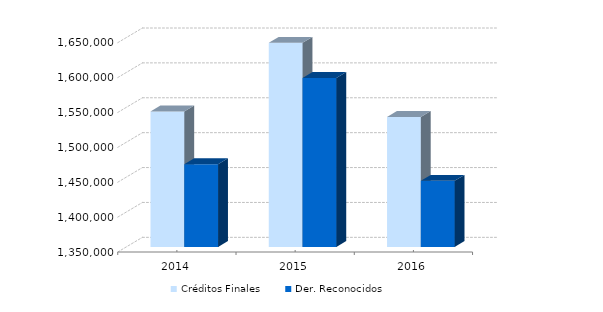
| Category | Créditos Finales | Der. Reconocidos |
|---|---|---|
| 2014.0 | 1544240.44 | 1468607.32 |
| 2015.0 | 1642508.38 | 1592262.83 |
| 2016.0 | 1536381.5 | 1444841.06 |